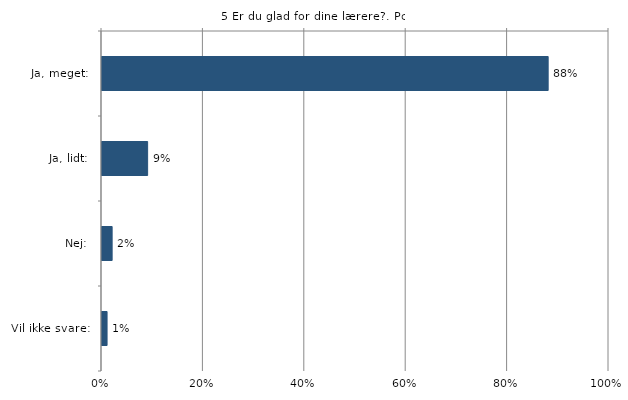
| Category | Er du glad for dine lærere? |
|---|---|
| Ja, meget:  | 0.88 |
| Ja, lidt:  | 0.09 |
| Nej:  | 0.02 |
| Vil ikke svare:  | 0.01 |